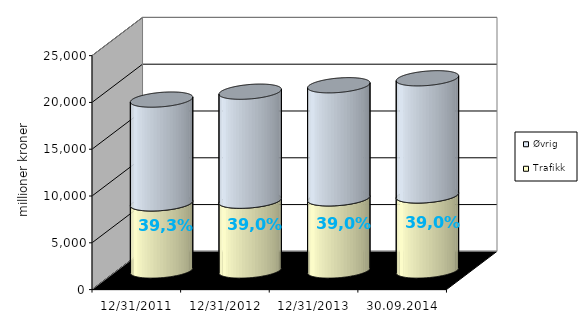
| Category | Trafikk | Øvrig |
|---|---|---|
| 31.12.2011 | 7171.76 | 11089.078 |
| 31.12.2012 | 7457.552 | 11647.433 |
| 31.12.2013 | 7709.892 | 12083.527 |
| 30.09.2014 | 8018.56 | 12518.861 |